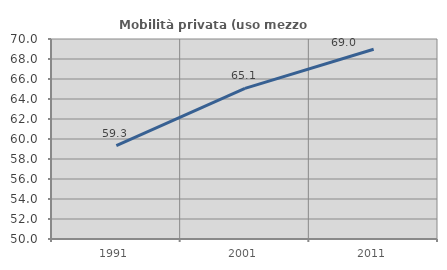
| Category | Mobilità privata (uso mezzo privato) |
|---|---|
| 1991.0 | 59.328 |
| 2001.0 | 65.066 |
| 2011.0 | 68.98 |